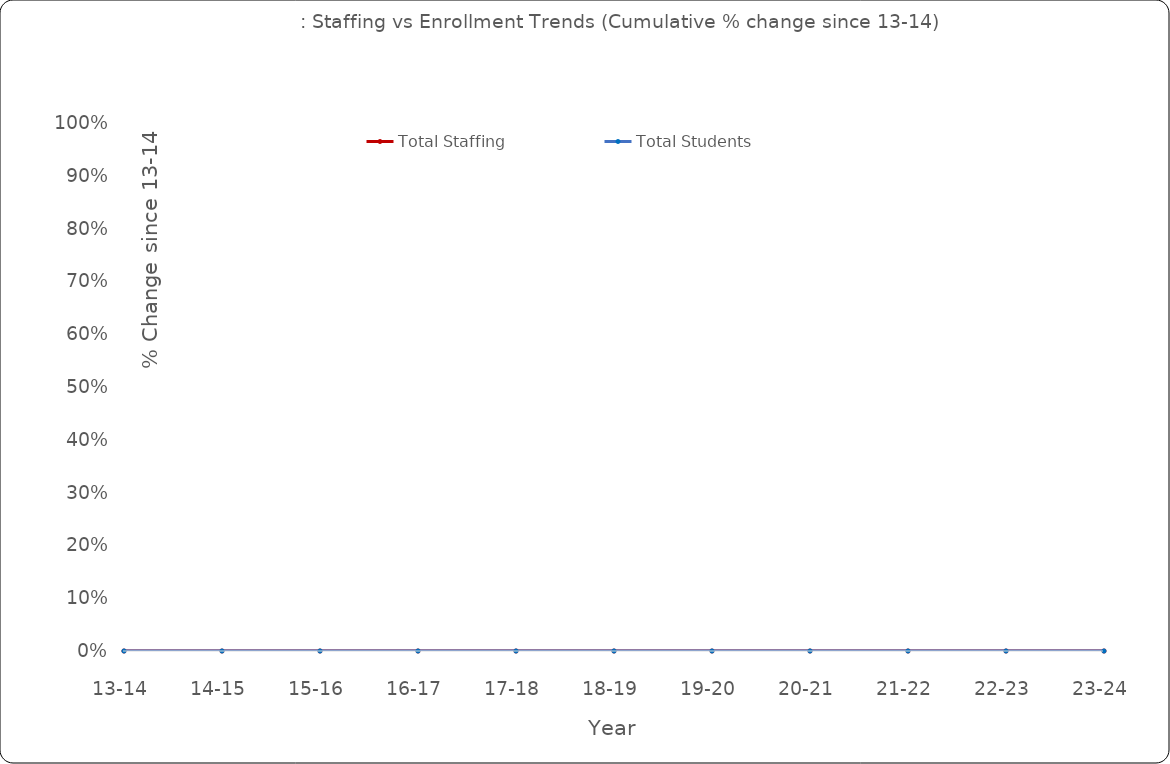
| Category | Total Staffing | Total Students |
|---|---|---|
| 13-14 | 0 | 0 |
| 14-15 | 0 | 0 |
| 15-16 | 0 | 0 |
| 16-17 | 0 | 0 |
| 17-18 | 0 | 0 |
| 18-19 | 0 | 0 |
| 19-20 | 0 | 0 |
| 20-21 | 0 | 0 |
| 21-22 | 0 | 0 |
| 22-23 | 0 | 0 |
| 23-24 | 0 | 0 |